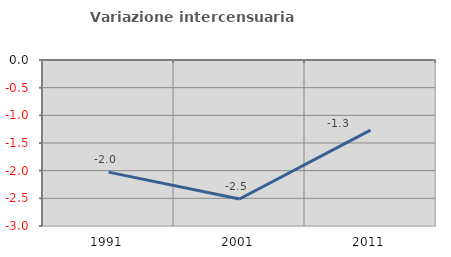
| Category | Variazione intercensuaria annua |
|---|---|
| 1991.0 | -2.027 |
| 2001.0 | -2.511 |
| 2011.0 | -1.267 |